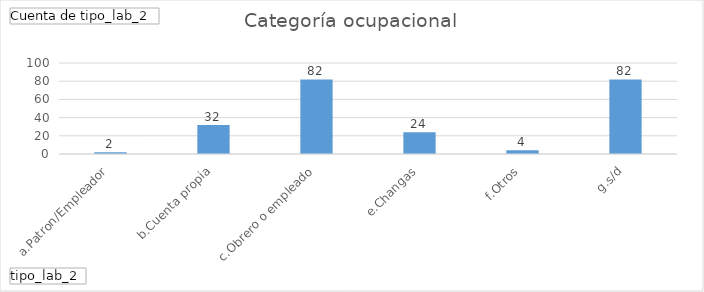
| Category | Total |
|---|---|
| a.Patron/Empleador | 2 |
| b.Cuenta propia | 32 |
| c.Obrero o empleado | 82 |
| e.Changas | 24 |
| f.Otros | 4 |
| g.s/d | 82 |